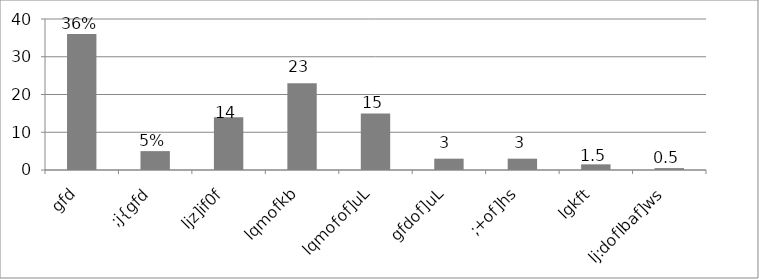
| Category | Series 0 |
|---|---|
| gfd | 36 |
| ;j{gfd | 5 |
| ljz]if0f | 14 |
| lqmofkb | 23 |
| lqmofof]uL | 15 |
| gfdof]uL | 3 |
| ;+of]hs | 3 |
| lgkft | 1.5 |
| lj:doflbaf]ws | 0.5 |